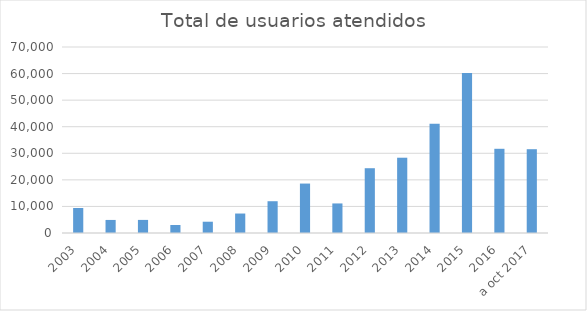
| Category | Series 0 |
|---|---|
| 2003 | 9418 |
| 2004 | 4914 |
| 2005 | 4927 |
| 2006 | 3020 |
| 2007 | 4246 |
| 2008 | 7329 |
| 2009 | 11960 |
| 2010 | 18607 |
| 2011 | 11123 |
| 2012 | 24381 |
| 2013 | 28334 |
| 2014 | 41118 |
| 2015 | 60201 |
| 2016 | 31690 |
| a oct 2017 | 31535 |